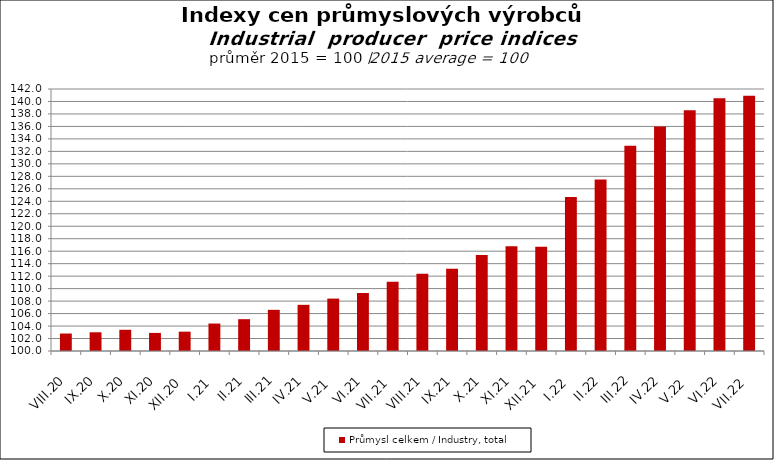
| Category | Průmysl celkem / Industry, total |
|---|---|
| VIII.20 | 102.8 |
| IX.20 | 103 |
| X.20 | 103.4 |
| XI.20 | 102.9 |
| XII.20 | 103.1 |
| I.21 | 104.4 |
| II.21 | 105.1 |
| III.21 | 106.6 |
| IV.21 | 107.4 |
| V.21 | 108.4 |
| VI.21 | 109.3 |
| VII.21 | 111.1 |
| VIII.21 | 112.4 |
| IX.21 | 113.2 |
| X.21 | 115.4 |
| XI.21 | 116.8 |
| XII.21 | 116.7 |
| I.22 | 124.7 |
| II.22 | 127.5 |
| III.22 | 132.9 |
| IV.22 | 136 |
| V.22 | 138.6 |
| VI.22 | 140.5 |
| VII.22 | 140.9 |